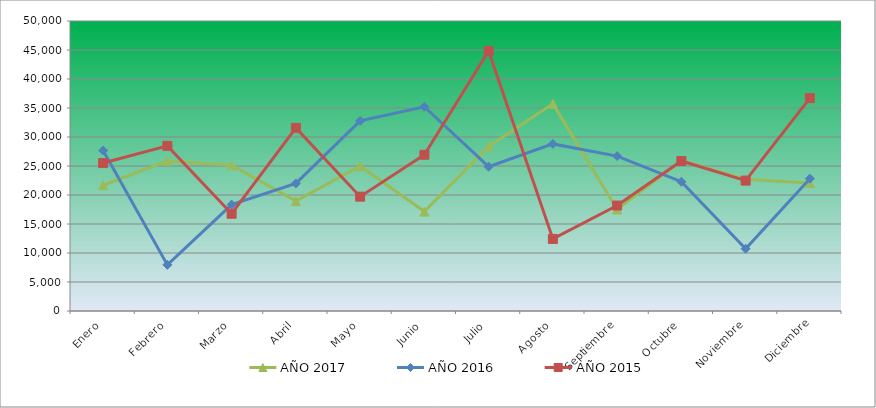
| Category | AÑO 2017 | AÑO 2016 | AÑO 2015 |
|---|---|---|---|
| Enero | 21676.494 | 27670.419 | 25507.808 |
| Febrero | 25878.278 | 7953.527 | 28472.919 |
| Marzo | 25132.166 | 18342.208 | 16769.568 |
| Abril | 18947.297 | 21994.939 | 31575.486 |
| Mayo | 24994.725 | 32776.387 | 19715.042 |
| Junio | 17140.923 | 35211.541 | 26941.273 |
| Julio | 28391.494 | 24881.775 | 44830.12 |
| Agosto | 35715.165 | 28809.442 | 12429.902 |
| Septiembre | 17513.978 | 26708.14 | 18183.395 |
| Octubre | 25937.181 | 22289.514 | 25861.265 |
| Noviembre | 22697.488 | 10742.171 | 22483.788 |
| Diciembre | 22069.184 | 22819.749 | 36700.611 |